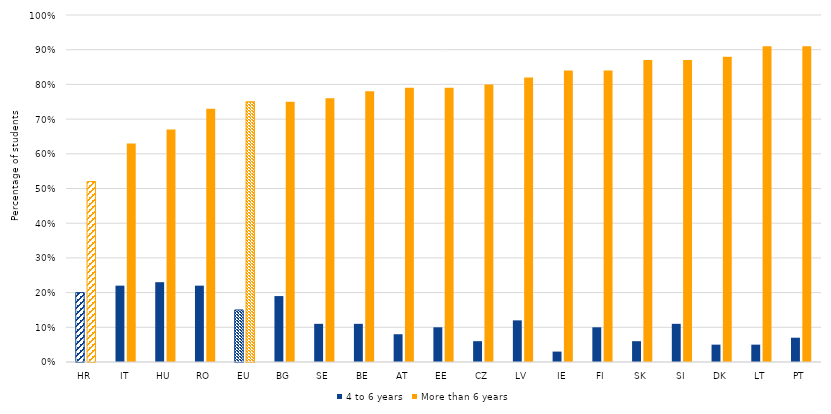
| Category | 4 to 6 years | More than 6 years |
|---|---|---|
| HR | 0.2 | 0.52 |
| IT | 0.22 | 0.63 |
| HU | 0.23 | 0.67 |
| RO | 0.22 | 0.73 |
| EU | 0.15 | 0.75 |
| BG | 0.19 | 0.75 |
| SE | 0.11 | 0.76 |
| BE | 0.11 | 0.78 |
| AT | 0.08 | 0.79 |
| EE | 0.1 | 0.79 |
| CZ | 0.06 | 0.8 |
| LV | 0.12 | 0.82 |
| IE | 0.03 | 0.84 |
| FI | 0.1 | 0.84 |
| SK | 0.06 | 0.87 |
| SI | 0.11 | 0.87 |
| DK | 0.05 | 0.88 |
| LT | 0.05 | 0.91 |
| PT | 0.07 | 0.91 |